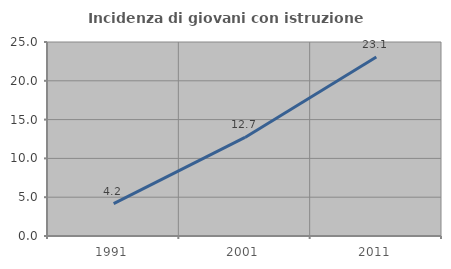
| Category | Incidenza di giovani con istruzione universitaria |
|---|---|
| 1991.0 | 4.167 |
| 2001.0 | 12.698 |
| 2011.0 | 23.077 |